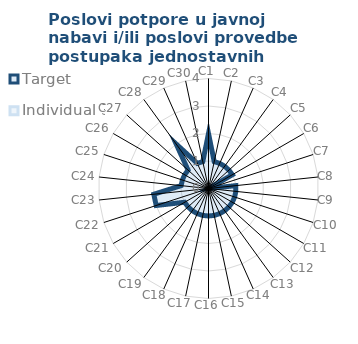
| Category | Target | Individual 3 |
|---|---|---|
| C1 | 2 | 0 |
| C2 | 1 | 0 |
| C3 | 1 | 0 |
| C4 | 1 | 0 |
| C5 | 1 | 0 |
| C6 | 1 | 0 |
| C7 | 0 | 0 |
| C8 | 1 | 0 |
| C9 | 1 | 0 |
| C10 | 1 | 0 |
| C11 | 1 | 0 |
| C12 | 1 | 0 |
| C13 | 1 | 0 |
| C14 | 1 | 0 |
| C15 | 1 | 0 |
| C16 | 1 | 0 |
| C17 | 1 | 0 |
| C18 | 1 | 0 |
| C19 | 1 | 0 |
| C20 | 1 | 0 |
| C21 | 1 | 0 |
| C22 | 2 | 0 |
| C23 | 2 | 0 |
| C24 | 1 | 0 |
| C25 | 1 | 0 |
| C26 | 1 | 0 |
| C27 | 1 | 0 |
| C28 | 2 | 0 |
| C29 | 1 | 0 |
| C30 | 1 | 0 |